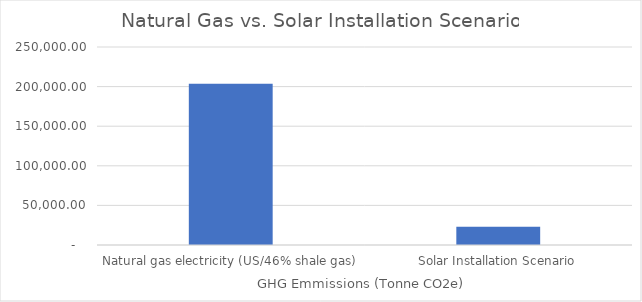
| Category | Series 0 |
|---|---|
| Natural gas electricity (US/46% shale gas) | 203651.55 |
| Solar Installation Scenario | 23062.263 |